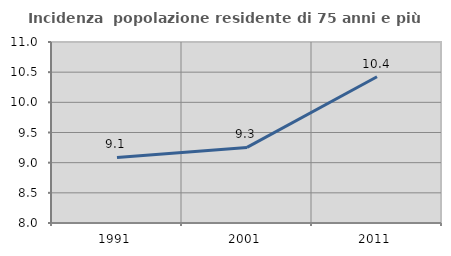
| Category | Incidenza  popolazione residente di 75 anni e più |
|---|---|
| 1991.0 | 9.087 |
| 2001.0 | 9.253 |
| 2011.0 | 10.425 |